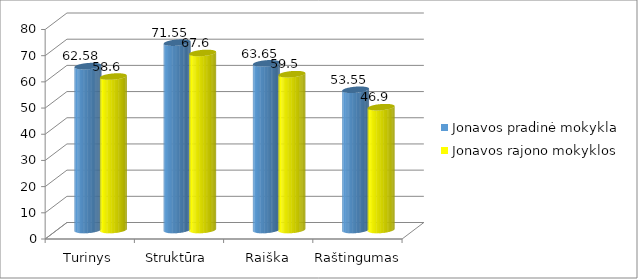
| Category | Jonavos pradinė mokykla | Jonavos rajono mokyklos |
|---|---|---|
| Turinys | 62.58 | 58.6 |
| Struktūra | 71.55 | 67.6 |
| Raiška | 63.65 | 59.5 |
| Raštingumas | 53.55 | 46.9 |